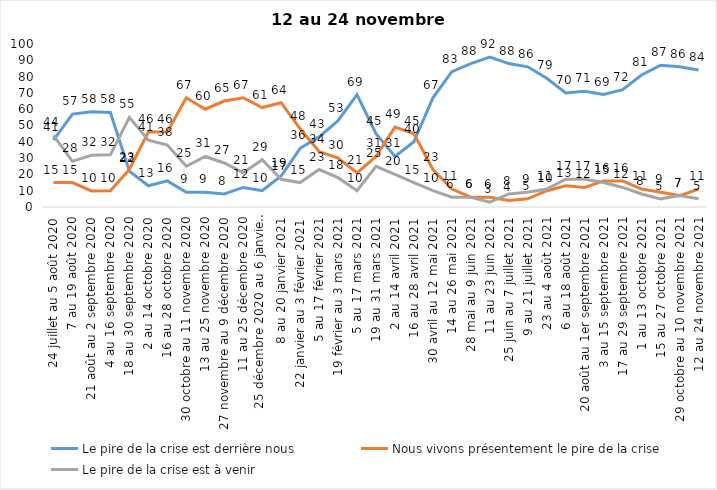
| Category | Le pire de la crise est derrière nous | Nous vivons présentement le pire de la crise | Le pire de la crise est à venir |
|---|---|---|---|
| 24 juillet au 5 août 2020 | 41 | 15 | 44 |
| 7 au 19 août 2020 | 57 | 15 | 28 |
| 21 août au 2 septembre 2020 | 58.39 | 9.84 | 31.77 |
| 4 au 16 septembre 2020 | 58 | 10 | 32 |
| 18 au 30 septembre 2020 | 22 | 23 | 55 |
| 2 au 14 octobre 2020 | 13 | 46 | 41 |
| 16 au 28 octobre 2020 | 16 | 46 | 38 |
| 30 octobre au 11 novembre 2020 | 9 | 67 | 25 |
| 13 au 25 novembre 2020 | 9 | 60 | 31 |
| 27 novembre au 9 décembre 2020 | 8 | 65 | 27 |
| 11 au 25 décembre 2020 | 12 | 67 | 21 |
| 25 décembre 2020 au 6 janvier 2021 | 10 | 61 | 29 |
| 8 au 20 janvier 2021 | 19 | 64 | 17 |
| 22 janvier au 3 février 2021 | 36 | 48 | 15 |
| 5 au 17 février 2021 | 43 | 34 | 23 |
| 19 février au 3 mars 2021 | 53 | 30 | 18 |
| 5 au 17 mars 2021 | 69 | 21 | 10 |
| 19 au 31 mars 2021 | 45 | 31 | 25 |
| 2 au 14 avril 2021 | 31 | 49 | 20 |
| 16 au 28 avril 2021 | 40 | 45 | 15 |
| 30 avril au 12 mai 2021 | 67 | 23 | 10 |
| 14 au 26 mai 2021 | 83 | 11 | 6 |
| 28 mai au 9 juin 2021 | 88 | 6 | 6 |
| 11 au 23 juin 2021 | 92 | 6 | 3 |
| 25 juin au 7 juillet 2021 | 88 | 4 | 8 |
| 9 au 21 juillet 2021 | 86 | 5 | 9 |
| 23 au 4 août 2021 | 79 | 10 | 11 |
| 6 au 18 août 2021 | 70 | 13 | 17 |
| 20 août au 1er septembre 2021 | 71 | 12 | 17 |
| 3 au 15 septembre 2021 | 69 | 16 | 15 |
| 17 au 29 septembre 2021 | 72 | 16 | 12 |
| 1 au 13 octobre 2021 | 81 | 11 | 8 |
| 15 au 27 octobre 2021 | 87 | 9 | 5 |
| 29 octobre au 10 novembre 2021 | 86 | 7 | 7 |
| 12 au 24 novembre 2021 | 84 | 11 | 5 |